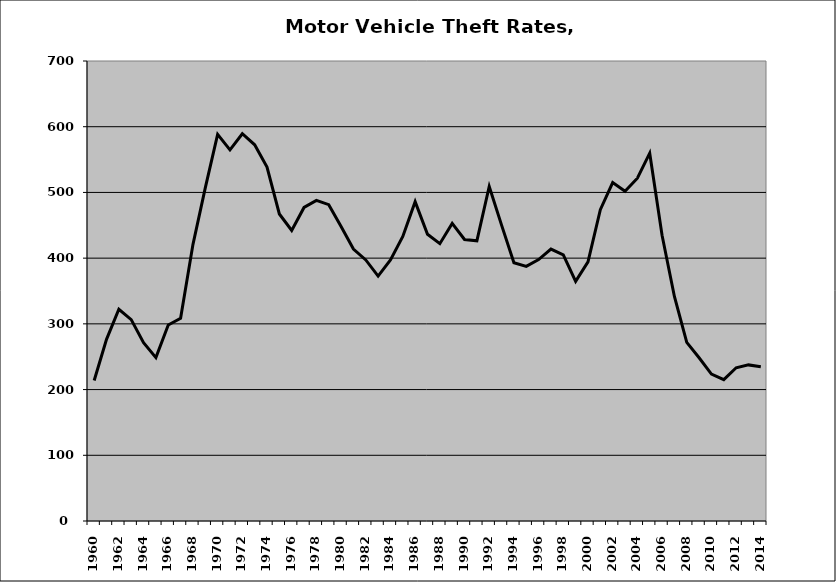
| Category | Motor Vehicle |
|---|---|
| 1960.0 | 213.803 |
| 1961.0 | 276.474 |
| 1962.0 | 322.181 |
| 1963.0 | 306.476 |
| 1964.0 | 271.211 |
| 1965.0 | 248.654 |
| 1966.0 | 298.331 |
| 1967.0 | 308.354 |
| 1968.0 | 420.605 |
| 1969.0 | 507 |
| 1970.0 | 588.422 |
| 1971.0 | 564.827 |
| 1972.0 | 589.308 |
| 1973.0 | 572.466 |
| 1974.0 | 538.582 |
| 1975.0 | 467.167 |
| 1976.0 | 442.044 |
| 1977.0 | 477.129 |
| 1978.0 | 487.94 |
| 1979.0 | 481.421 |
| 1980.0 | 448.269 |
| 1981.0 | 413.905 |
| 1982.0 | 397.274 |
| 1983.0 | 372.666 |
| 1984.0 | 397.294 |
| 1985.0 | 432.931 |
| 1986.0 | 485.95 |
| 1987.0 | 436.256 |
| 1988.0 | 422.036 |
| 1989.0 | 452.879 |
| 1990.0 | 428.364 |
| 1991.0 | 426.444 |
| 1992.0 | 508.991 |
| 1993.0 | 450.308 |
| 1994.0 | 392.916 |
| 1995.0 | 387.51 |
| 1996.0 | 397.75 |
| 1997.0 | 413.743 |
| 1998.0 | 405.112 |
| 1999.0 | 364.756 |
| 2000.0 | 394.326 |
| 2001.0 | 473.799 |
| 2002.0 | 515.057 |
| 2003.0 | 501.712 |
| 2004.0 | 521.62 |
| 2005.0 | 559.712 |
| 2006.0 | 434.765 |
| 2007.0 | 341.684 |
| 2008.0 | 271.863 |
| 2009.0 | 248.371 |
| 2010.0 | 223.634 |
| 2011.0 | 215.038 |
| 2012.0 | 233.184 |
| 2013.0 | 237.553 |
| 2014.0 | 234.771 |